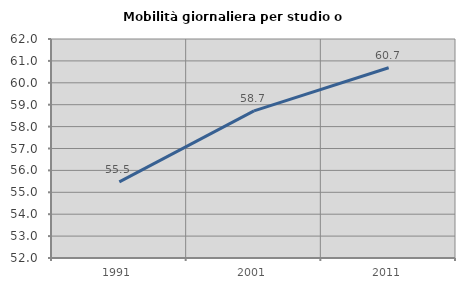
| Category | Mobilità giornaliera per studio o lavoro |
|---|---|
| 1991.0 | 55.476 |
| 2001.0 | 58.718 |
| 2011.0 | 60.687 |